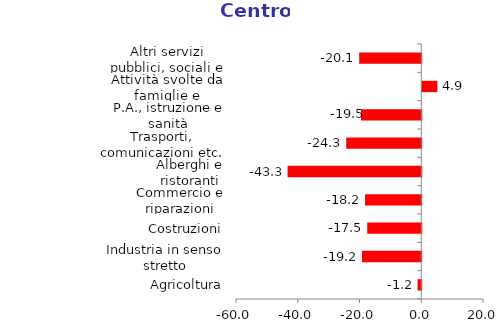
| Category | Centro |
|---|---|
| Agricoltura | -1.2 |
| Industria in senso stretto | -19.2 |
| Costruzioni | -17.5 |
| Commercio e riparazioni | -18.2 |
| Alberghi e ristoranti | -43.3 |
| Trasporti, comunicazioni etc. | -24.3 |
| P.A., istruzione e sanità | -19.5 |
| Attività svolte da famiglie e convivenze | 4.9 |
| Altri servizi pubblici, sociali e personali | -20.1 |